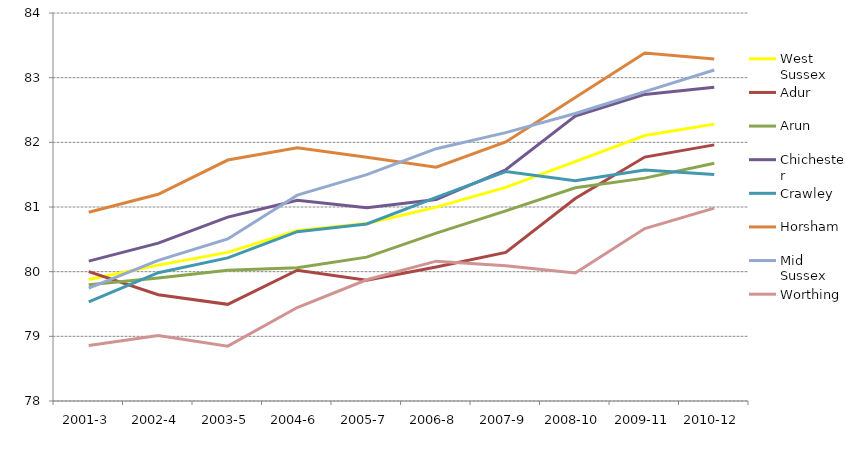
| Category | West Sussex | Adur | Arun | Chichester | Crawley | Horsham | Mid Sussex | Worthing |
|---|---|---|---|---|---|---|---|---|
| 2001-3 | 79.878 | 80 | 79.798 | 80.163 | 79.533 | 80.919 | 79.745 | 78.859 |
| 2002-4 | 80.101 | 79.644 | 79.901 | 80.441 | 79.984 | 81.196 | 80.175 | 79.012 |
| 2003-5 | 80.298 | 79.494 | 80.02 | 80.843 | 80.213 | 81.726 | 80.507 | 78.848 |
| 2004-6 | 80.636 | 80.022 | 80.06 | 81.104 | 80.618 | 81.916 | 81.183 | 79.446 |
| 2005-7 | 80.743 | 79.867 | 80.225 | 80.988 | 80.738 | 81.768 | 81.5 | 79.875 |
| 2006-8 | 80.998 | 80.072 | 80.597 | 81.114 | 81.148 | 81.617 | 81.901 | 80.162 |
| 2007-9 | 81.303 | 80.298 | 80.941 | 81.576 | 81.547 | 82.007 | 82.15 | 80.092 |
| 2008-10 | 81.701 | 81.131 | 81.297 | 82.406 | 81.408 | 82.692 | 82.446 | 79.98 |
| 2009-11 | 82.105 | 81.772 | 81.446 | 82.741 | 81.573 | 83.382 | 82.784 | 80.667 |
| 2010-12 | 82.282 | 81.961 | 81.678 | 82.851 | 81.504 | 83.287 | 83.119 | 80.982 |